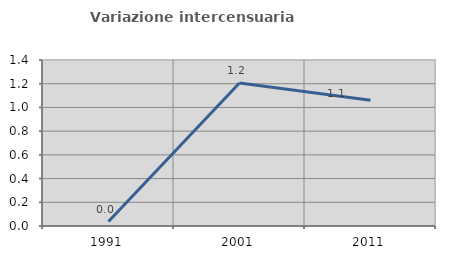
| Category | Variazione intercensuaria annua |
|---|---|
| 1991.0 | 0.038 |
| 2001.0 | 1.206 |
| 2011.0 | 1.061 |